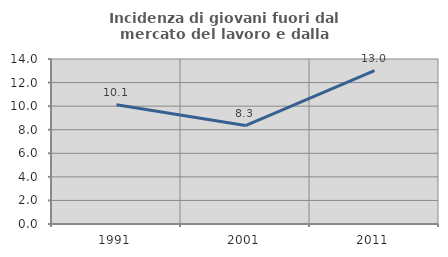
| Category | Incidenza di giovani fuori dal mercato del lavoro e dalla formazione  |
|---|---|
| 1991.0 | 10.114 |
| 2001.0 | 8.349 |
| 2011.0 | 13.015 |